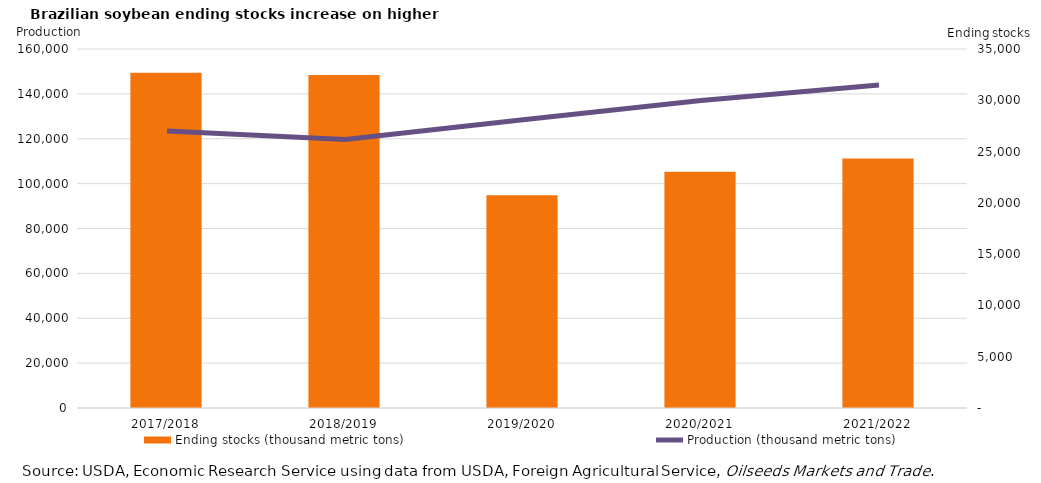
| Category | Ending stocks (thousand metric tons) |
|---|---|
| 0 | 32696 |
| 1 | 32472 |
| 2 | 20736 |
| 3 | 23036 |
| 4 | 24335 |